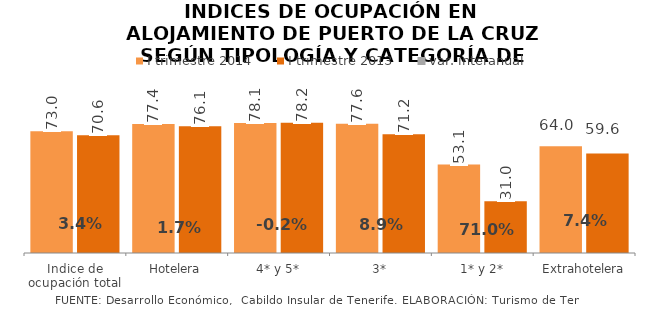
| Category | I trimestre 2014 | I trimestre 2013 |
|---|---|---|
| Indice de ocupación total | 73.01 | 70.611 |
| Hotelera | 77.362 | 76.089 |
| 4* y 5* | 78.051 | 78.207 |
| 3* | 77.57 | 71.21 |
| 1* y 2* | 53.056 | 31.026 |
| Extrahotelera | 64.025 | 59.632 |